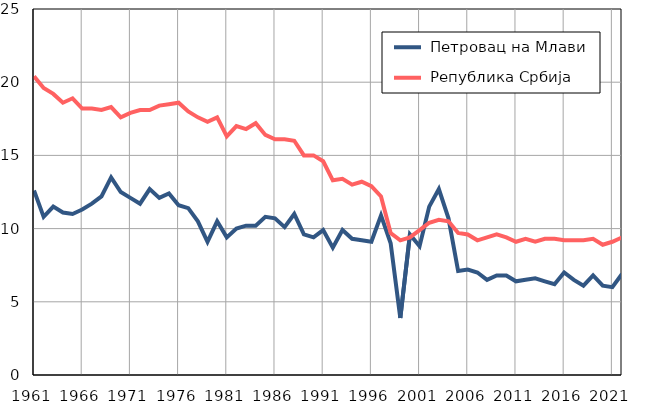
| Category |  Петровац на Млави |  Република Србија |
|---|---|---|
| 1961.0 | 12.6 | 20.4 |
| 1962.0 | 10.8 | 19.6 |
| 1963.0 | 11.5 | 19.2 |
| 1964.0 | 11.1 | 18.6 |
| 1965.0 | 11 | 18.9 |
| 1966.0 | 11.3 | 18.2 |
| 1967.0 | 11.7 | 18.2 |
| 1968.0 | 12.2 | 18.1 |
| 1969.0 | 13.5 | 18.3 |
| 1970.0 | 12.5 | 17.6 |
| 1971.0 | 12.1 | 17.9 |
| 1972.0 | 11.7 | 18.1 |
| 1973.0 | 12.7 | 18.1 |
| 1974.0 | 12.1 | 18.4 |
| 1975.0 | 12.4 | 18.5 |
| 1976.0 | 11.6 | 18.6 |
| 1977.0 | 11.4 | 18 |
| 1978.0 | 10.5 | 17.6 |
| 1979.0 | 9.1 | 17.3 |
| 1980.0 | 10.5 | 17.6 |
| 1981.0 | 9.4 | 16.3 |
| 1982.0 | 10 | 17 |
| 1983.0 | 10.2 | 16.8 |
| 1984.0 | 10.2 | 17.2 |
| 1985.0 | 10.8 | 16.4 |
| 1986.0 | 10.7 | 16.1 |
| 1987.0 | 10.1 | 16.1 |
| 1988.0 | 11 | 16 |
| 1989.0 | 9.6 | 15 |
| 1990.0 | 9.4 | 15 |
| 1991.0 | 9.9 | 14.6 |
| 1992.0 | 8.7 | 13.3 |
| 1993.0 | 9.9 | 13.4 |
| 1994.0 | 9.3 | 13 |
| 1995.0 | 9.2 | 13.2 |
| 1996.0 | 9.1 | 12.9 |
| 1997.0 | 10.9 | 12.2 |
| 1998.0 | 9 | 9.7 |
| 1999.0 | 3.9 | 9.2 |
| 2000.0 | 9.6 | 9.4 |
| 2001.0 | 8.8 | 9.9 |
| 2002.0 | 11.5 | 10.4 |
| 2003.0 | 12.7 | 10.6 |
| 2004.0 | 10.7 | 10.5 |
| 2005.0 | 7.1 | 9.7 |
| 2006.0 | 7.2 | 9.6 |
| 2007.0 | 7 | 9.2 |
| 2008.0 | 6.5 | 9.4 |
| 2009.0 | 6.8 | 9.6 |
| 2010.0 | 6.8 | 9.4 |
| 2011.0 | 6.4 | 9.1 |
| 2012.0 | 6.5 | 9.3 |
| 2013.0 | 6.6 | 9.1 |
| 2014.0 | 6.4 | 9.3 |
| 2015.0 | 6.2 | 9.3 |
| 2016.0 | 7 | 9.2 |
| 2017.0 | 6.5 | 9.2 |
| 2018.0 | 6.1 | 9.2 |
| 2019.0 | 6.8 | 9.3 |
| 2020.0 | 6.1 | 8.9 |
| 2021.0 | 6 | 9.1 |
| 2022.0 | 6.9 | 9.4 |